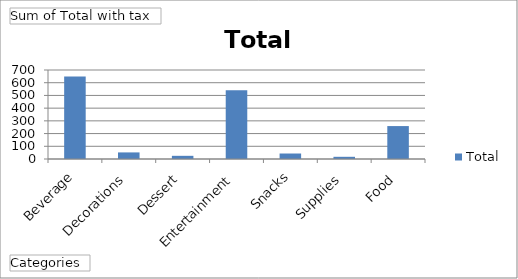
| Category | Total |
|---|---|
| Beverage | 648 |
| Decorations | 51.84 |
| Dessert | 25 |
| Entertainment | 540 |
| Snacks | 43.2 |
| Supplies | 17.28 |
| Food | 259 |